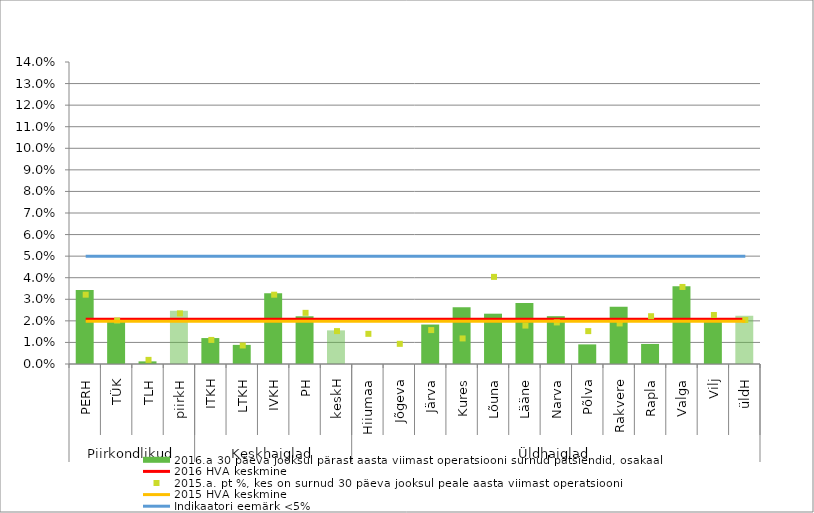
| Category | 2016.a 30 päeva jooksul pärast aasta viimast operatsiooni surnud patsiendid, osakaal  |
|---|---|
| 0 | 0.034 |
| 1 | 0.021 |
| 2 | 0.001 |
| 3 | 0.025 |
| 4 | 0.012 |
| 5 | 0.009 |
| 6 | 0.033 |
| 7 | 0.022 |
| 8 | 0.016 |
| 9 | 0 |
| 10 | 0 |
| 11 | 0.018 |
| 12 | 0.026 |
| 13 | 0.023 |
| 14 | 0.028 |
| 15 | 0.022 |
| 16 | 0.009 |
| 17 | 0.027 |
| 18 | 0.009 |
| 19 | 0.036 |
| 20 | 0.021 |
| 21 | 0.022 |